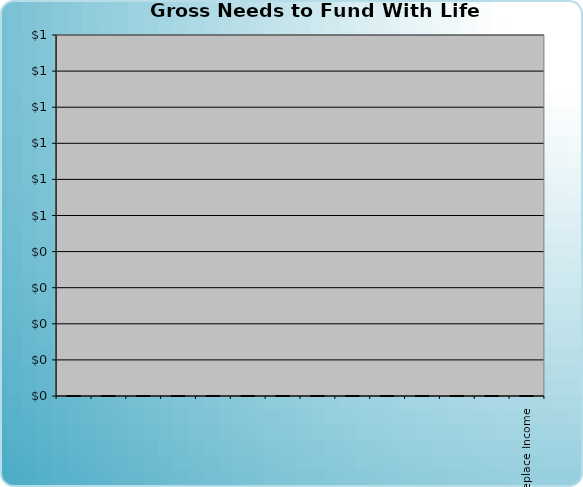
| Category | Series 0 |
|---|---|
|   | 0 |
|   | 0 |
|   | 0 |
|   | 0 |
|   | 0 |
|   | 0 |
|   | 0 |
|   | 0 |
|   | 0 |
|   | 0 |
|   | 0 |
|   | 0 |
|   | 0 |
| Replace Income | 0 |